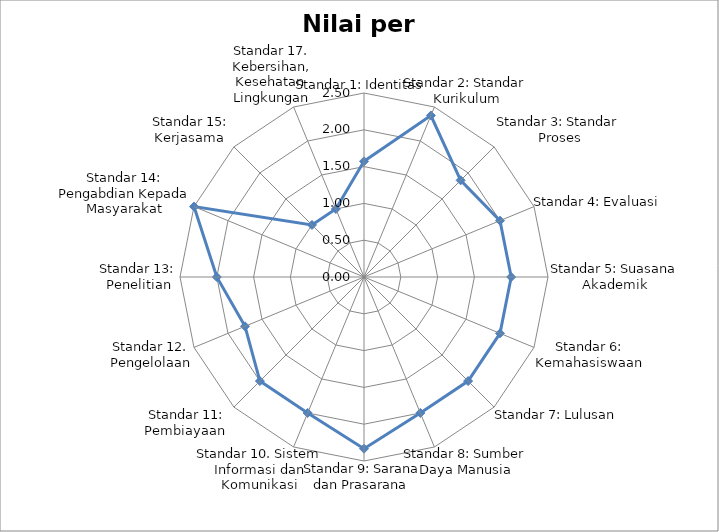
| Category | Nilai per standar |
|---|---|
| Standar 1: Identitas | 1.571 |
| Standar 2: Standar Kurikulum | 2.375 |
| Standar 3: Standar Proses | 1.857 |
| Standar 4: Evaluasi | 2 |
| Standar 5: Suasana Akademik | 2 |
| Standar 6: Kemahasiswaan | 2 |
| Standar 7: Lulusan  | 2 |
| Standar 8: Sumber Daya Manusia | 2 |
| Standar 9: Sarana dan Prasarana  | 2.333 |
| Standar 10. Sistem Informasi dan Komunikasi | 2 |
| Standar 11: Pembiayaan  | 2 |
| Standar 12. Pengelolaan | 1.75 |
| Standar 13: Penelitian | 2 |
| Standar 14: Pengabdian Kepada Masyarakat | 2.5 |
| Standar 15: Kerjasama  | 1 |
| Standar 17. Kebersihan, Kesehatan  Lingkungan | 1 |